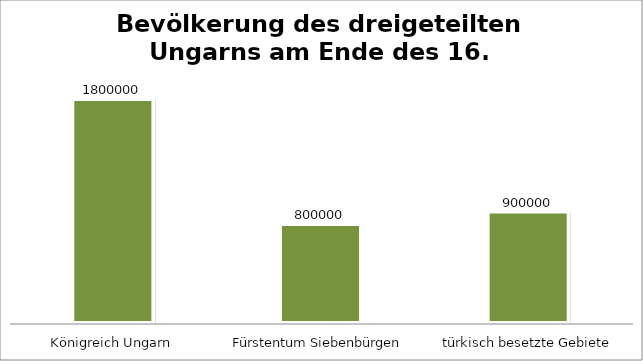
| Category | Series 0 |
|---|---|
| Königreich Ungarn | 1800000 |
| Fürstentum Siebenbürgen | 800000 |
| türkisch besetzte Gebiete | 900000 |